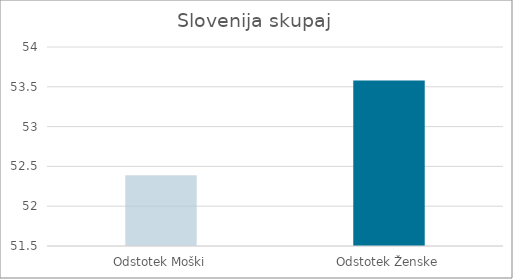
| Category | Series 0 |
|---|---|
| Odstotek Moški | 52.39 |
| Odstotek Ženske | 53.58 |